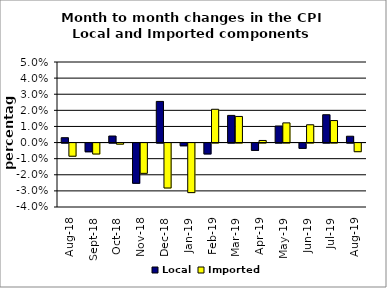
| Category | Local | Imported |
|---|---|---|
| 2018-08-01 | 0.003 | -0.008 |
| 2018-09-01 | -0.005 | -0.007 |
| 2018-10-01 | 0.004 | -0.001 |
| 2018-11-01 | -0.025 | -0.019 |
| 2018-12-01 | 0.026 | -0.028 |
| 2019-01-01 | -0.002 | -0.031 |
| 2019-02-01 | -0.007 | 0.021 |
| 2019-03-01 | 0.017 | 0.016 |
| 2019-04-01 | -0.005 | 0.001 |
| 2019-05-01 | 0.01 | 0.012 |
| 2019-06-01 | -0.003 | 0.011 |
| 2019-07-01 | 0.017 | 0.014 |
| 2019-08-01 | 0.004 | -0.005 |